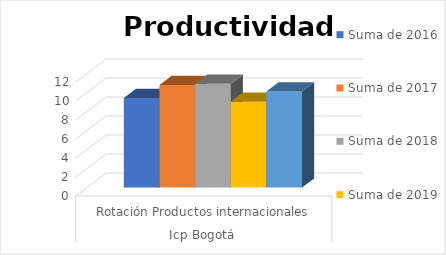
| Category | Suma de 2016 | Suma de 2017 | Suma de 2018 | Suma de 2019 | Suma de Pronostico 2020 suavización |
|---|---|---|---|---|---|
| 0 | 9.435 | 10.803 | 10.944 | 9.051 | 10.117 |